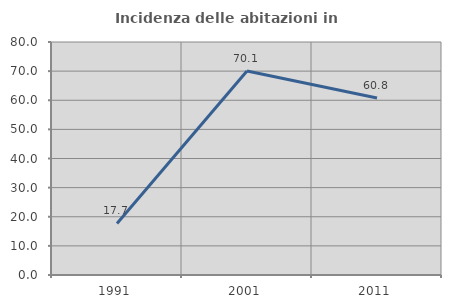
| Category | Incidenza delle abitazioni in proprietà  |
|---|---|
| 1991.0 | 17.708 |
| 2001.0 | 70.073 |
| 2011.0 | 60.777 |